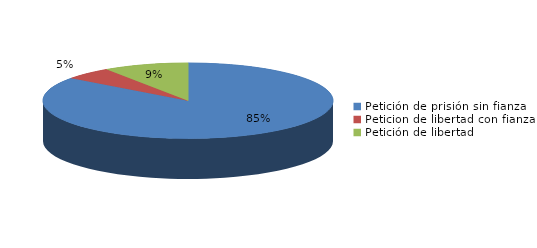
| Category | Series 0 |
|---|---|
| Petición de prisión sin fianza | 63 |
| Peticion de libertad con fianza | 4 |
| Petición de libertad | 7 |